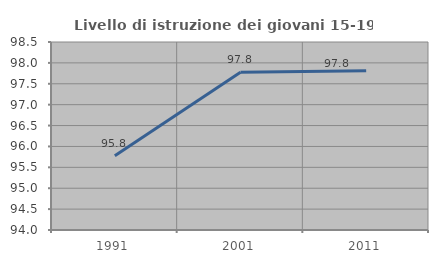
| Category | Livello di istruzione dei giovani 15-19 anni |
|---|---|
| 1991.0 | 95.775 |
| 2001.0 | 97.778 |
| 2011.0 | 97.81 |